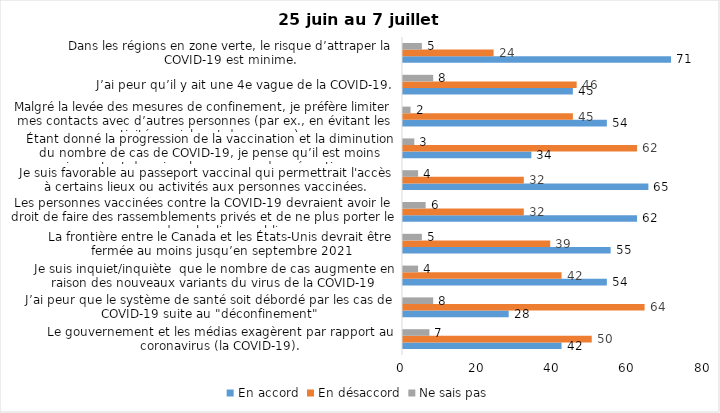
| Category | En accord | En désaccord | Ne sais pas |
|---|---|---|---|
| Le gouvernement et les médias exagèrent par rapport au coronavirus (la COVID-19). | 42 | 50 | 7 |
| J’ai peur que le système de santé soit débordé par les cas de COVID-19 suite au "déconfinement" | 28 | 64 | 8 |
| Je suis inquiet/inquiète  que le nombre de cas augmente en raison des nouveaux variants du virus de la COVID-19 | 54 | 42 | 4 |
| La frontière entre le Canada et les États-Unis devrait être fermée au moins jusqu’en septembre 2021 | 55 | 39 | 5 |
| Les personnes vaccinées contre la COVID-19 devraient avoir le droit de faire des rassemblements privés et de ne plus porter le masque dans les lieux publics. | 62 | 32 | 6 |
| Je suis favorable au passeport vaccinal qui permettrait l'accès à certains lieux ou activités aux personnes vaccinées. | 65 | 32 | 4 |
| Étant donné la progression de la vaccination et la diminution du nombre de cas de COVID-19, je pense qu’il est moins important de suivre les mesures de prévention. | 34 | 62 | 3 |
| Malgré la levée des mesures de confinement, je préfère limiter mes contacts avec d’autres personnes (par ex., en évitant les activités sociales et de groupes) | 54 | 45 | 2 |
| J’ai peur qu’il y ait une 4e vague de la COVID-19. | 45 | 46 | 8 |
| Dans les régions en zone verte, le risque d’attraper la COVID-19 est minime. | 71 | 24 | 5 |